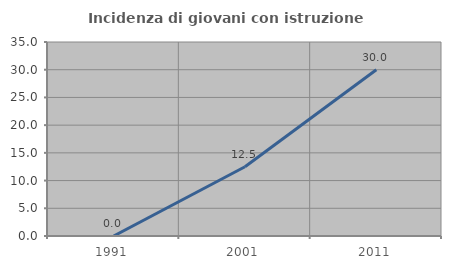
| Category | Incidenza di giovani con istruzione universitaria |
|---|---|
| 1991.0 | 0 |
| 2001.0 | 12.5 |
| 2011.0 | 30 |